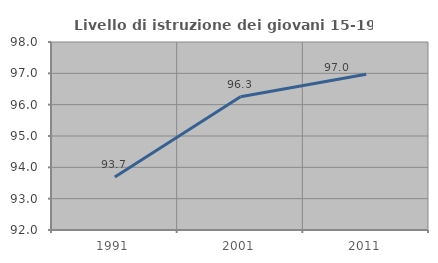
| Category | Livello di istruzione dei giovani 15-19 anni |
|---|---|
| 1991.0 | 93.694 |
| 2001.0 | 96.25 |
| 2011.0 | 96.97 |